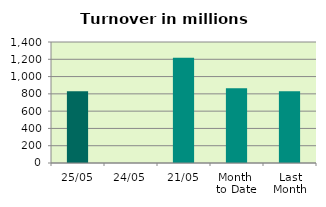
| Category | Series 0 |
|---|---|
| 25/05 | 829.266 |
| 24/05 | 0 |
| 21/05 | 1218.751 |
| Month 
to Date | 863.551 |
| Last
Month | 829.993 |